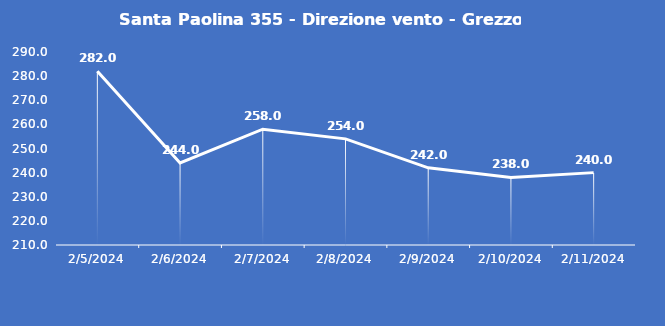
| Category | Santa Paolina 355 - Direzione vento - Grezzo (°N) |
|---|---|
| 2/5/24 | 282 |
| 2/6/24 | 244 |
| 2/7/24 | 258 |
| 2/8/24 | 254 |
| 2/9/24 | 242 |
| 2/10/24 | 238 |
| 2/11/24 | 240 |